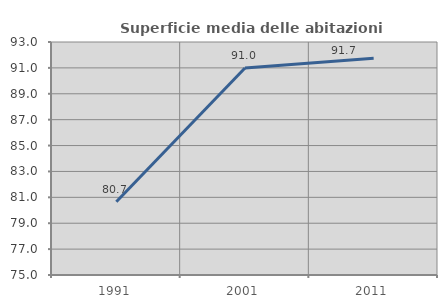
| Category | Superficie media delle abitazioni occupate |
|---|---|
| 1991.0 | 80.656 |
| 2001.0 | 90.992 |
| 2011.0 | 91.744 |